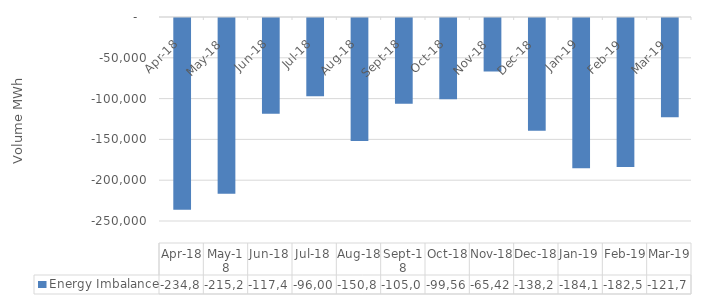
| Category | Energy Imbalance |
|---|---|
| 2018-04-01 | -234870.387 |
| 2018-05-01 | -215243.538 |
| 2018-06-01 | -117411.796 |
| 2018-07-01 | -96007.773 |
| 2018-08-01 | -150869.867 |
| 2018-09-01 | -105024.459 |
| 2018-10-01 | -99560.492 |
| 2018-11-01 | -65426.647 |
| 2018-12-01 | -138263.425 |
| 2019-01-01 | -184154.07 |
| 2019-02-01 | -182507.74 |
| 2019-03-01 | -121717.378 |